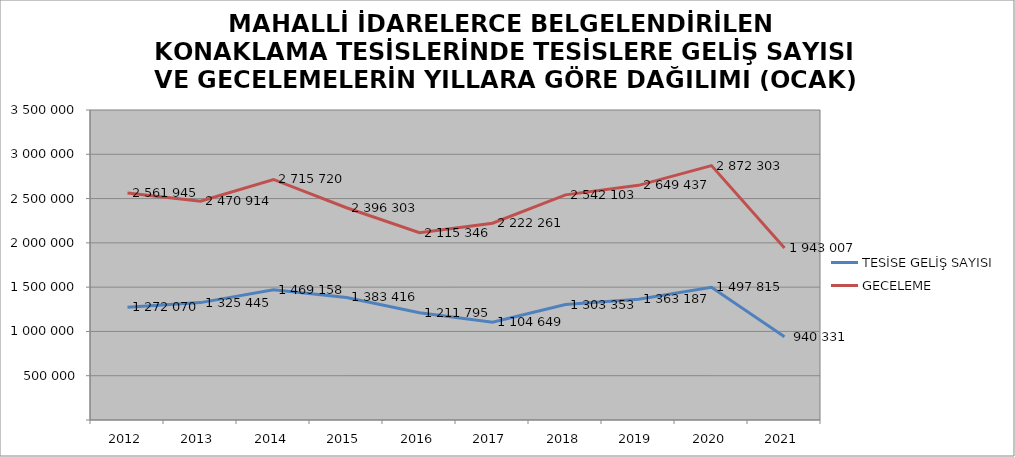
| Category | TESİSE GELİŞ SAYISI | GECELEME |
|---|---|---|
| 2012 | 1272070 | 2561945 |
| 2013 | 1325445 | 2470914 |
| 2014 | 1469158 | 2715720 |
| 2015 | 1383416 | 2396303 |
| 2016 | 1211795 | 2115346 |
| 2017 | 1104649 | 2222261 |
| 2018 | 1303353 | 2542103 |
| 2019 | 1363187 | 2649437 |
| 2020 | 1497815 | 2872303 |
| 2021 | 940331 | 1943007 |